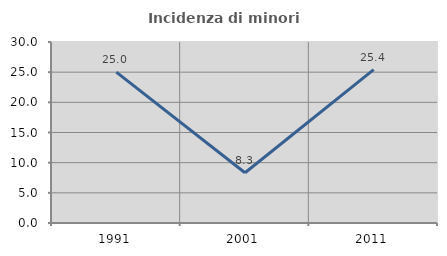
| Category | Incidenza di minori stranieri |
|---|---|
| 1991.0 | 25 |
| 2001.0 | 8.333 |
| 2011.0 | 25.424 |